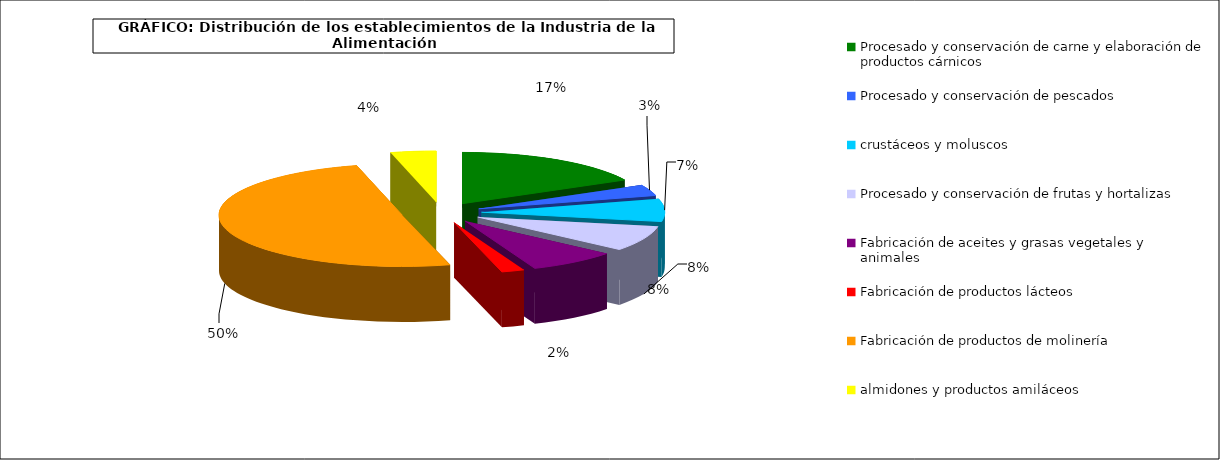
| Category | Procesado y conservación de carne y elaboración de productos cárnicos |
|---|---|
| 0 | 4490 |
| 1 | 894 |
| 2 | 1846 |
| 3 | 2071 |
| 4 | 2032 |
| 5 | 521 |
| 6 | 12987 |
| 7 | 1038 |